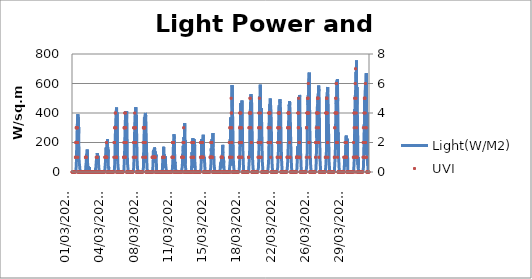
| Category | Light(W/M2) |
|---|---|
|  01/03/2022 00:20:09 | 0 |
|  01/03/2022 00:50:09 | 0 |
|  01/03/2022 01:20:09 | 0 |
|  01/03/2022 01:50:09 | 0 |
|  01/03/2022 02:20:09 | 0 |
|  01/03/2022 02:50:09 | 0 |
|  01/03/2022 03:20:09 | 0 |
|  01/03/2022 03:50:09 | 0 |
|  01/03/2022 04:20:09 | 0 |
|  01/03/2022 04:50:09 | 0 |
|  01/03/2022 05:20:09 | 0 |
|  01/03/2022 05:50:09 | 0 |
|  01/03/2022 06:20:09 | 0 |
|  01/03/2022 06:50:09 | 0 |
|  01/03/2022 07:20:09 | 6.9 |
|  01/03/2022 07:50:09 | 28.1 |
|  01/03/2022 08:20:09 | 44.2 |
|  01/03/2022 08:50:09 | 107 |
|  01/03/2022 09:20:09 | 170.4 |
|  01/03/2022 09:50:09 | 222.9 |
|  01/03/2022 10:20:09 | 274.5 |
|  01/03/2022 10:50:09 | 315.4 |
|  01/03/2022 11:20:09 | 345.7 |
|  01/03/2022 11:50:09 | 383.4 |
|  01/03/2022 12:20:09 | 391.7 |
|  01/03/2022 12:50:09 | 91.9 |
|  01/03/2022 15:54:06 | 243.7 |
|  01/03/2022 16:24:06 | 371.8 |
|  01/03/2022 16:54:06 | 261.1 |
|  01/03/2022 17:24:06 | 156.6 |
|  01/03/2022 17:54:06 | 82 |
|  01/03/2022 18:24:06 | 58.5 |
|  01/03/2022 18:54:06 | 47.7 |
|  01/03/2022 19:24:06 | 36 |
|  01/03/2022 19:54:06 | 18.1 |
|  01/03/2022 20:24:06 | 2.1 |
|  01/03/2022 20:54:06 | 0 |
|  01/03/2022 21:24:06 | 0 |
|  01/03/2022 21:54:06 | 0 |
|  01/03/2022 22:24:06 | 0 |
|  01/03/2022 22:54:06 | 0 |
|  01/03/2022 23:24:06 | 0 |
|  01/03/2022 23:54:06 | 0 |
|  02/03/2022 00:24:06 | 0 |
|  02/03/2022 00:54:06 | 0 |
|  02/03/2022 01:24:06 | 0 |
|  02/03/2022 01:54:06 | 0 |
|  02/03/2022 02:24:06 | 0 |
|  02/03/2022 02:54:06 | 0 |
|  02/03/2022 03:24:06 | 0 |
|  02/03/2022 03:54:06 | 0 |
|  02/03/2022 04:24:06 | 0 |
|  02/03/2022 04:54:06 | 0 |
|  02/03/2022 05:24:06 | 0 |
|  02/03/2022 05:54:06 | 0 |
|  02/03/2022 06:24:06 | 0 |
|  02/03/2022 06:54:06 | 0 |
|  02/03/2022 07:24:06 | 0 |
|  02/03/2022 07:54:06 | 0 |
|  02/03/2022 08:24:06 | 0 |
|  02/03/2022 08:54:06 | 0 |
|  02/03/2022 09:24:06 | 0 |
|  02/03/2022 09:54:06 | 5.1 |
|  02/03/2022 10:24:06 | 17.7 |
|  02/03/2022 10:54:06 | 50.6 |
|  02/03/2022 11:24:06 | 59 |
|  02/03/2022 11:54:06 | 60.7 |
|  02/03/2022 12:24:06 | 121.4 |
|  02/03/2022 12:54:06 | 101 |
|  02/03/2022 13:24:06 | 78.1 |
|  02/03/2022 13:54:06 | 130.5 |
|  02/03/2022 14:24:06 | 152.2 |
|  02/03/2022 14:54:06 | 82 |
|  02/03/2022 15:24:06 | 39.4 |
|  02/03/2022 15:54:06 | 24.7 |
|  02/03/2022 16:24:06 | 18.1 |
|  02/03/2022 16:54:06 | 39 |
|  02/03/2022 17:24:06 | 21.6 |
|  02/03/2022 17:54:06 | 15.2 |
|  02/03/2022 18:24:06 | 6.5 |
|  02/03/2022 18:54:06 | 3.4 |
|  02/03/2022 19:24:06 | 34.3 |
|  02/03/2022 19:54:06 | 1.2 |
|  02/03/2022 20:24:06 | 0 |
|  02/03/2022 20:54:06 | 0 |
|  02/03/2022 21:24:06 | 0 |
|  02/03/2022 21:54:06 | 0 |
|  02/03/2022 22:24:06 | 0 |
|  02/03/2022 22:54:06 | 0 |
|  02/03/2022 23:24:06 | 0 |
|  02/03/2022 23:54:06 | 0 |
|  03/03/2022 00:24:06 | 0 |
|  03/03/2022 00:54:06 | 0 |
|  03/03/2022 01:24:06 | 0 |
|  03/03/2022 01:54:06 | 0 |
|  03/03/2022 02:24:06 | 0 |
|  03/03/2022 02:54:06 | 0 |
|  03/03/2022 03:24:06 | 0 |
|  03/03/2022 03:54:06 | 0 |
|  03/03/2022 04:24:06 | 0 |
|  03/03/2022 04:54:06 | 0 |
|  03/03/2022 05:24:06 | 0 |
|  03/03/2022 05:54:06 | 0 |
|  03/03/2022 06:24:06 | 0 |
|  03/03/2022 06:54:06 | 0 |
|  03/03/2022 07:24:06 | 0 |
|  03/03/2022 07:54:06 | 0 |
|  03/03/2022 08:24:06 | 0 |
|  03/03/2022 08:54:06 | 0 |
|  03/03/2022 09:24:06 | 0 |
|  03/03/2022 09:54:06 | 3.4 |
|  03/03/2022 10:24:06 | 8.2 |
|  03/03/2022 10:54:06 | 21.6 |
|  03/03/2022 11:24:06 | 22.9 |
|  03/03/2022 11:54:06 | 32.1 |
|  03/03/2022 12:24:06 | 56.8 |
|  03/03/2022 12:54:06 | 59.8 |
|  03/03/2022 13:24:06 | 91 |
|  03/03/2022 13:54:06 | 77.6 |
|  03/03/2022 14:24:06 | 64.1 |
|  03/03/2022 14:54:06 | 96.3 |
|  03/03/2022 15:24:06 | 128.3 |
|  03/03/2022 15:54:06 | 91.9 |
|  03/03/2022 16:24:06 | 71.9 |
|  03/03/2022 16:54:06 | 109.7 |
|  03/03/2022 17:24:06 | 58.1 |
|  03/03/2022 17:54:06 | 107.5 |
|  03/03/2022 18:24:06 | 59.3 |
|  03/03/2022 18:54:06 | 37.2 |
|  03/03/2022 19:24:06 | 21.2 |
|  03/03/2022 19:54:06 | 4.8 |
|  03/03/2022 20:24:06 | 0 |
|  03/03/2022 20:54:06 | 0 |
|  03/03/2022 21:24:06 | 0 |
|  03/03/2022 21:54:06 | 0 |
|  03/03/2022 22:24:06 | 0 |
|  03/03/2022 22:54:06 | 0 |
|  03/03/2022 23:24:06 | 0 |
|  03/03/2022 23:54:06 | 0 |
|  04/03/2022 00:24:06 | 0 |
|  04/03/2022 00:54:06 | 0 |
|  04/03/2022 01:24:06 | 0 |
|  04/03/2022 01:54:06 | 0 |
|  04/03/2022 02:24:06 | 0 |
|  04/03/2022 02:54:06 | 0 |
|  04/03/2022 03:24:06 | 0 |
|  04/03/2022 03:54:06 | 0 |
|  04/03/2022 04:24:06 | 0 |
|  04/03/2022 04:54:06 | 0 |
|  04/03/2022 05:24:06 | 0 |
|  04/03/2022 05:54:06 | 0 |
|  04/03/2022 06:24:06 | 0 |
|  04/03/2022 06:54:06 | 0 |
|  04/03/2022 07:24:06 | 0 |
|  04/03/2022 07:54:06 | 0 |
|  04/03/2022 08:24:06 | 0 |
|  04/03/2022 08:54:06 | 0 |
|  04/03/2022 09:24:06 | 0 |
|  04/03/2022 09:54:06 | 11.3 |
|  04/03/2022 10:24:06 | 20.3 |
|  04/03/2022 10:54:06 | 42.4 |
|  04/03/2022 11:24:06 | 58.1 |
|  04/03/2022 11:54:06 | 88.4 |
|  04/03/2022 12:24:06 | 94.1 |
|  04/03/2022 12:54:06 | 133.1 |
|  04/03/2022 13:24:06 | 166.5 |
|  04/03/2022 13:54:06 | 117.4 |
|  04/03/2022 14:24:06 | 143.5 |
|  04/03/2022 14:54:06 | 151.8 |
|  04/03/2022 15:24:06 | 147.9 |
|  04/03/2022 15:54:06 | 197.3 |
|  04/03/2022 16:24:06 | 142.6 |
|  04/03/2022 16:54:06 | 223.7 |
|  04/03/2022 17:24:06 | 90.6 |
|  04/03/2022 17:54:06 | 151.8 |
|  04/03/2022 18:24:06 | 92.4 |
|  04/03/2022 18:54:06 | 27.6 |
|  04/03/2022 19:24:06 | 40.7 |
|  04/03/2022 19:54:06 | 22.9 |
|  04/03/2022 20:24:06 | 2.9 |
|  04/03/2022 20:54:06 | 0 |
|  04/03/2022 21:24:06 | 0 |
|  04/03/2022 21:54:06 | 0 |
|  04/03/2022 22:24:06 | 0 |
|  04/03/2022 22:54:06 | 0 |
|  04/03/2022 23:24:06 | 0 |
|  04/03/2022 23:54:06 | 0 |
|  05/03/2022 00:24:06 | 0 |
|  05/03/2022 00:54:06 | 0 |
|  05/03/2022 01:24:06 | 0 |
|  05/03/2022 01:54:06 | 0 |
|  05/03/2022 02:24:06 | 0 |
|  05/03/2022 02:54:06 | 0 |
|  05/03/2022 03:24:06 | 0 |
|  05/03/2022 03:54:06 | 0 |
|  05/03/2022 04:24:06 | 0 |
|  05/03/2022 04:54:06 | 0 |
|  05/03/2022 05:24:06 | 0 |
|  05/03/2022 05:54:06 | 0 |
|  05/03/2022 06:24:06 | 0 |
|  05/03/2022 06:54:06 | 0 |
|  05/03/2022 07:24:06 | 0 |
|  05/03/2022 07:54:06 | 0 |
|  05/03/2022 08:24:06 | 0 |
|  05/03/2022 08:54:06 | 0 |
|  05/03/2022 09:24:06 | 0.9 |
|  05/03/2022 09:54:06 | 14.3 |
|  05/03/2022 10:24:06 | 33.4 |
|  05/03/2022 10:54:06 | 60.2 |
|  05/03/2022 11:24:06 | 134 |
|  05/03/2022 11:54:06 | 202.6 |
|  05/03/2022 12:24:06 | 255.9 |
|  05/03/2022 12:54:06 | 304.9 |
|  05/03/2022 13:24:06 | 340.9 |
|  05/03/2022 13:54:06 | 380 |
|  05/03/2022 14:24:06 | 396 |
|  05/03/2022 14:54:06 | 419.9 |
|  05/03/2022 15:24:06 | 437.7 |
|  05/03/2022 15:54:06 | 77.6 |
|  05/03/2022 16:24:06 | 404.2 |
|  05/03/2022 16:54:06 | 182.5 |
|  05/03/2022 17:24:06 | 192.1 |
|  05/03/2022 17:54:06 | 132.2 |
|  05/03/2022 18:24:06 | 65.4 |
|  05/03/2022 18:54:06 | 59.8 |
|  05/03/2022 19:24:06 | 26.8 |
|  05/03/2022 19:54:06 | 21.2 |
|  05/03/2022 20:24:06 | 4.3 |
|  05/03/2022 20:54:06 | 0 |
|  05/03/2022 21:24:06 | 0 |
|  05/03/2022 21:54:06 | 0 |
|  05/03/2022 22:24:06 | 0 |
|  05/03/2022 22:54:06 | 0 |
|  05/03/2022 23:24:06 | 0 |
|  05/03/2022 23:54:06 | 0 |
|  06/03/2022 00:24:06 | 0 |
|  06/03/2022 00:54:06 | 0 |
|  06/03/2022 01:24:06 | 0 |
|  06/03/2022 01:54:06 | 0 |
|  06/03/2022 02:24:06 | 0 |
|  06/03/2022 02:54:06 | 0 |
|  06/03/2022 03:24:06 | 0 |
|  06/03/2022 03:54:06 | 0 |
|  06/03/2022 04:24:06 | 0 |
|  06/03/2022 04:54:06 | 0 |
|  06/03/2022 05:24:06 | 0 |
|  06/03/2022 05:54:06 | 0 |
|  06/03/2022 06:24:06 | 0 |
|  06/03/2022 06:54:06 | 0 |
|  06/03/2022 07:24:06 | 0 |
|  06/03/2022 07:54:06 | 0 |
|  06/03/2022 08:24:06 | 0 |
|  06/03/2022 08:54:06 | 0 |
|  06/03/2022 09:24:06 | 1.2 |
|  06/03/2022 09:54:06 | 17.7 |
|  06/03/2022 10:24:06 | 53.7 |
|  06/03/2022 10:54:06 | 55.9 |
|  06/03/2022 11:24:06 | 116.6 |
|  06/03/2022 11:54:06 | 200.7 |
|  06/03/2022 12:24:06 | 265.5 |
|  06/03/2022 12:54:06 | 316.2 |
|  06/03/2022 13:24:06 | 351.3 |
|  06/03/2022 13:54:06 | 386.5 |
|  06/03/2022 14:24:06 | 413.4 |
|  06/03/2022 14:54:06 | 366 |
|  06/03/2022 15:24:06 | 170.4 |
|  06/03/2022 15:54:06 | 155.7 |
|  06/03/2022 16:24:06 | 412.5 |
|  06/03/2022 16:54:06 | 401.3 |
|  06/03/2022 17:24:06 | 275.4 |
|  06/03/2022 17:54:06 | 206.9 |
|  06/03/2022 18:24:06 | 96.6 |
|  06/03/2022 18:54:06 | 55.1 |
|  06/03/2022 19:24:06 | 37.2 |
|  06/03/2022 19:54:06 | 25.1 |
|  06/03/2022 20:24:06 | 4.8 |
|  06/03/2022 20:54:06 | 0 |
|  06/03/2022 21:24:06 | 0 |
|  06/03/2022 21:54:06 | 0 |
|  06/03/2022 22:24:06 | 0 |
|  06/03/2022 22:54:06 | 0 |
|  06/03/2022 23:24:06 | 0 |
|  06/03/2022 23:54:06 | 0 |
|  07/03/2022 00:24:06 | 0 |
|  07/03/2022 00:54:06 | 0 |
|  07/03/2022 01:24:06 | 0 |
|  07/03/2022 01:54:06 | 0 |
|  07/03/2022 02:24:06 | 0 |
|  07/03/2022 02:54:06 | 0 |
|  07/03/2022 03:24:06 | 0 |
|  07/03/2022 03:54:06 | 0 |
|  07/03/2022 04:24:06 | 0 |
|  07/03/2022 04:54:06 | 0 |
|  07/03/2022 05:24:06 | 0 |
|  07/03/2022 05:54:06 | 0 |
|  07/03/2022 06:24:06 | 0 |
|  07/03/2022 06:54:06 | 0 |
|  07/03/2022 07:24:06 | 0 |
|  07/03/2022 07:54:06 | 0 |
|  07/03/2022 08:24:06 | 0 |
|  07/03/2022 08:54:06 | 0 |
|  07/03/2022 09:24:06 | 1.2 |
|  07/03/2022 09:54:06 | 18.1 |
|  07/03/2022 10:24:06 | 47.2 |
|  07/03/2022 10:54:06 | 85 |
|  07/03/2022 11:24:06 | 95.4 |
|  07/03/2022 11:54:06 | 199.9 |
|  07/03/2022 12:24:06 | 256.8 |
|  07/03/2022 12:54:06 | 319.7 |
|  07/03/2022 13:24:06 | 357 |
|  07/03/2022 13:54:06 | 386.9 |
|  07/03/2022 14:24:06 | 406 |
|  07/03/2022 14:54:06 | 168.2 |
|  07/03/2022 15:24:06 | 438.9 |
|  07/03/2022 15:54:06 | 312.7 |
|  07/03/2022 16:24:06 | 386.9 |
|  07/03/2022 16:54:06 | 340.5 |
|  07/03/2022 17:24:06 | 274.5 |
|  07/03/2022 17:54:06 | 212.1 |
|  07/03/2022 18:24:06 | 124 |
|  07/03/2022 18:54:06 | 57.3 |
|  07/03/2022 19:24:06 | 41.1 |
|  07/03/2022 19:54:06 | 23.9 |
|  07/03/2022 20:24:06 | 6.9 |
|  07/03/2022 20:54:06 | 0 |
|  07/03/2022 21:24:06 | 0 |
|  07/03/2022 21:54:06 | 0 |
|  07/03/2022 22:24:06 | 0 |
|  07/03/2022 22:54:06 | 0 |
|  07/03/2022 23:24:06 | 0 |
|  07/03/2022 23:54:06 | 0 |
|  08/03/2022 00:24:06 | 0 |
|  08/03/2022 00:54:06 | 0 |
|  08/03/2022 01:24:06 | 0 |
|  08/03/2022 01:54:06 | 0 |
|  08/03/2022 02:24:06 | 0 |
|  08/03/2022 02:54:06 | 0 |
|  08/03/2022 03:24:06 | 0 |
|  08/03/2022 03:54:06 | 0 |
|  08/03/2022 04:24:06 | 0 |
|  08/03/2022 04:54:06 | 0 |
|  08/03/2022 05:24:06 | 0 |
|  08/03/2022 05:54:06 | 0 |
|  08/03/2022 06:24:06 | 0 |
|  08/03/2022 06:54:06 | 0 |
|  08/03/2022 07:24:06 | 0 |
|  08/03/2022 07:54:06 | 0 |
|  08/03/2022 08:24:06 | 0 |
|  08/03/2022 08:54:06 | 0 |
|  08/03/2022 09:24:06 | 2.6 |
|  08/03/2022 09:54:06 | 21.2 |
|  08/03/2022 10:24:06 | 28.6 |
|  08/03/2022 10:54:06 | 87.1 |
|  08/03/2022 11:24:06 | 130 |
|  08/03/2022 11:54:06 | 64.6 |
|  08/03/2022 12:24:06 | 258 |
|  08/03/2022 12:54:06 | 371.3 |
|  08/03/2022 13:24:06 | 348.8 |
|  08/03/2022 13:54:06 | 372.6 |
|  08/03/2022 14:24:06 | 380.3 |
|  08/03/2022 14:54:06 | 382.2 |
|  08/03/2022 15:24:06 | 400.4 |
|  08/03/2022 15:54:06 | 403 |
|  08/03/2022 16:24:06 | 375.2 |
|  08/03/2022 16:54:06 | 294.5 |
|  08/03/2022 17:24:06 | 247.2 |
|  08/03/2022 17:54:06 | 203.4 |
|  08/03/2022 18:24:06 | 141.4 |
|  08/03/2022 18:54:06 | 75.8 |
|  08/03/2022 19:24:06 | 33.4 |
|  08/03/2022 19:54:06 | 13.8 |
|  08/03/2022 20:24:06 | 5.1 |
|  08/03/2022 20:54:06 | 0 |
|  08/03/2022 21:24:06 | 0 |
|  08/03/2022 21:54:06 | 0 |
|  08/03/2022 22:24:06 | 0 |
|  08/03/2022 22:54:06 | 0 |
|  08/03/2022 23:24:06 | 0 |
|  08/03/2022 23:54:06 | 0 |
|  09/03/2022 00:24:06 | 0 |
|  09/03/2022 00:54:06 | 0 |
|  09/03/2022 01:24:06 | 0 |
|  09/03/2022 01:54:06 | 0 |
|  09/03/2022 02:24:06 | 0 |
|  09/03/2022 02:54:06 | 0 |
|  09/03/2022 03:24:06 | 0 |
|  09/03/2022 03:54:06 | 0 |
|  09/03/2022 04:24:06 | 0 |
|  09/03/2022 04:54:06 | 0 |
|  09/03/2022 05:24:06 | 0 |
|  09/03/2022 05:54:06 | 0 |
|  09/03/2022 06:24:06 | 0 |
|  09/03/2022 06:54:06 | 0 |
|  09/03/2022 07:24:06 | 0 |
|  09/03/2022 07:54:06 | 0 |
|  09/03/2022 08:24:06 | 0 |
|  09/03/2022 08:54:06 | 0 |
|  09/03/2022 09:24:06 | 2.9 |
|  09/03/2022 09:54:06 | 26.8 |
|  09/03/2022 10:24:06 | 47.2 |
|  09/03/2022 10:54:06 | 102.8 |
|  09/03/2022 11:24:06 | 149.6 |
|  09/03/2022 11:54:06 | 63.2 |
|  09/03/2022 12:24:06 | 111 |
|  09/03/2022 12:54:06 | 77.2 |
|  09/03/2022 13:24:06 | 70.7 |
|  09/03/2022 13:54:06 | 165.6 |
|  09/03/2022 14:24:06 | 167 |
|  09/03/2022 14:54:06 | 158.3 |
|  09/03/2022 15:24:06 | 111 |
|  09/03/2022 15:54:06 | 138.4 |
|  09/03/2022 16:24:06 | 117.1 |
|  09/03/2022 16:54:06 | 112.3 |
|  09/03/2022 17:24:06 | 99.7 |
|  09/03/2022 17:54:06 | 117.9 |
|  09/03/2022 18:24:06 | 109.2 |
|  09/03/2022 18:54:06 | 46.7 |
|  09/03/2022 19:24:06 | 13.3 |
|  09/03/2022 19:54:06 | 5.1 |
|  09/03/2022 20:24:06 | 1.2 |
|  09/03/2022 20:54:06 | 0 |
|  09/03/2022 21:24:06 | 0 |
|  09/03/2022 21:54:06 | 0 |
|  09/03/2022 22:24:06 | 0 |
|  09/03/2022 22:54:06 | 0 |
|  09/03/2022 23:24:06 | 0 |
|  09/03/2022 23:54:06 | 0 |
|  10/03/2022 00:24:06 | 0 |
|  10/03/2022 00:54:06 | 0 |
|  10/03/2022 01:24:06 | 0 |
|  10/03/2022 01:54:06 | 0 |
|  10/03/2022 02:24:06 | 0 |
|  10/03/2022 02:54:06 | 0 |
|  10/03/2022 03:24:06 | 0 |
|  10/03/2022 03:54:06 | 0 |
|  10/03/2022 04:24:06 | 0 |
|  10/03/2022 04:54:06 | 0 |
|  10/03/2022 05:24:06 | 0 |
|  10/03/2022 05:54:06 | 0 |
|  10/03/2022 06:24:06 | 0 |
|  10/03/2022 06:54:06 | 0 |
|  10/03/2022 07:24:06 | 0 |
|  10/03/2022 07:54:06 | 0 |
|  10/03/2022 08:24:06 | 0 |
|  10/03/2022 08:54:06 | 0 |
|  10/03/2022 09:24:06 | 1.2 |
|  10/03/2022 09:54:06 | 18.1 |
|  10/03/2022 10:24:06 | 58.1 |
|  10/03/2022 10:54:06 | 40.2 |
|  10/03/2022 11:24:06 | 96.6 |
|  10/03/2022 11:54:06 | 92.4 |
|  10/03/2022 12:24:06 | 83.7 |
|  10/03/2022 12:54:06 | 170.4 |
|  10/03/2022 13:24:06 | 106.2 |
|  10/03/2022 13:54:06 | 121.8 |
|  10/03/2022 14:24:06 | 63.7 |
|  10/03/2022 14:54:06 | 97.1 |
|  10/03/2022 15:24:06 | 53.3 |
|  10/03/2022 15:54:06 | 63.2 |
|  10/03/2022 16:24:06 | 29 |
|  10/03/2022 16:54:06 | 106.2 |
|  10/03/2022 17:24:06 | 68 |
|  10/03/2022 17:54:06 | 62 |
|  10/03/2022 18:24:06 | 41.6 |
|  10/03/2022 18:54:06 | 26.8 |
|  10/03/2022 19:24:06 | 16.9 |
|  10/03/2022 19:54:06 | 7.7 |
|  10/03/2022 20:24:06 | 7.7 |
|  10/03/2022 20:54:06 | 0 |
|  10/03/2022 21:24:06 | 0 |
|  10/03/2022 21:54:06 | 0 |
|  10/03/2022 22:24:06 | 0 |
|  10/03/2022 22:54:06 | 0 |
|  10/03/2022 23:24:06 | 0 |
|  10/03/2022 23:54:06 | 0 |
|  11/03/2022 00:24:06 | 0 |
|  11/03/2022 00:54:06 | 0 |
|  11/03/2022 01:24:06 | 0 |
|  11/03/2022 01:54:06 | 0 |
|  11/03/2022 02:24:06 | 0 |
|  11/03/2022 02:54:06 | 0 |
|  11/03/2022 03:24:06 | 0 |
|  11/03/2022 03:54:06 | 0 |
|  11/03/2022 04:24:06 | 0 |
|  11/03/2022 04:54:06 | 0 |
|  11/03/2022 05:24:06 | 0 |
|  11/03/2022 05:54:06 | 0 |
|  11/03/2022 06:24:06 | 0 |
|  11/03/2022 06:54:06 | 0 |
|  11/03/2022 07:24:06 | 0 |
|  11/03/2022 07:54:06 | 0 |
|  11/03/2022 08:24:06 | 0 |
|  11/03/2022 08:54:06 | 0 |
|  11/03/2022 09:24:06 | 0 |
|  11/03/2022 09:54:06 | 3.8 |
|  11/03/2022 10:24:06 | 14.3 |
|  11/03/2022 10:54:06 | 22.9 |
|  11/03/2022 11:24:06 | 19.4 |
|  11/03/2022 11:54:06 | 22.9 |
|  11/03/2022 12:24:06 | 104.5 |
|  11/03/2022 12:54:06 | 117.1 |
|  11/03/2022 13:24:06 | 188.6 |
|  11/03/2022 13:54:06 | 207.4 |
|  11/03/2022 14:24:06 | 217.8 |
|  11/03/2022 14:54:06 | 255.9 |
|  11/03/2022 15:24:06 | 225.5 |
|  11/03/2022 15:54:06 | 207.4 |
|  11/03/2022 16:24:06 | 115.7 |
|  11/03/2022 16:54:06 | 58.5 |
|  11/03/2022 17:24:06 | 68.9 |
|  11/03/2022 17:54:06 | 27.3 |
|  11/03/2022 18:24:06 | 25.6 |
|  11/03/2022 18:54:06 | 21.6 |
|  11/03/2022 19:24:06 | 14.7 |
|  11/03/2022 19:54:06 | 7.3 |
|  11/03/2022 20:24:06 | 0.4 |
|  11/03/2022 20:54:06 | 0 |
|  11/03/2022 21:24:06 | 0 |
|  11/03/2022 21:54:06 | 0 |
|  11/03/2022 22:24:06 | 0 |
|  11/03/2022 22:54:06 | 0 |
|  11/03/2022 23:24:06 | 0 |
|  11/03/2022 23:54:06 | 0 |
|  12/03/2022 00:24:06 | 0 |
|  12/03/2022 00:54:06 | 0 |
|  12/03/2022 01:24:06 | 0 |
|  12/03/2022 01:54:06 | 0 |
|  12/03/2022 02:24:06 | 0 |
|  12/03/2022 02:54:06 | 0 |
|  12/03/2022 03:24:06 | 0 |
|  12/03/2022 03:54:06 | 0 |
|  12/03/2022 04:24:06 | 0 |
|  12/03/2022 04:54:06 | 0 |
|  12/03/2022 05:24:06 | 0 |
|  12/03/2022 05:54:06 | 0 |
|  12/03/2022 06:24:06 | 0 |
|  12/03/2022 06:54:06 | 0 |
|  12/03/2022 07:24:06 | 0 |
|  12/03/2022 07:54:06 | 0 |
|  12/03/2022 08:24:06 | 0 |
|  12/03/2022 08:54:06 | 0 |
|  12/03/2022 09:24:06 | 2.1 |
|  12/03/2022 09:54:06 | 8.6 |
|  12/03/2022 10:24:06 | 22 |
|  12/03/2022 10:54:06 | 20.8 |
|  12/03/2022 11:24:06 | 32.9 |
|  12/03/2022 11:54:06 | 65.4 |
|  12/03/2022 12:24:06 | 121 |
|  12/03/2022 12:54:06 | 86.2 |
|  12/03/2022 13:24:06 | 126.1 |
|  12/03/2022 13:54:06 | 178.2 |
|  12/03/2022 14:24:06 | 121 |
|  12/03/2022 14:54:06 | 175.7 |
|  12/03/2022 15:24:06 | 40.2 |
|  12/03/2022 15:54:06 | 236.4 |
|  12/03/2022 16:24:06 | 204.7 |
|  12/03/2022 16:54:06 | 113.2 |
|  12/03/2022 17:24:06 | 332.3 |
|  12/03/2022 17:54:06 | 52 |
|  12/03/2022 18:24:06 | 217.3 |
|  12/03/2022 18:54:06 | 60.7 |
|  12/03/2022 19:24:06 | 36.8 |
|  12/03/2022 19:54:06 | 25.9 |
|  12/03/2022 20:24:06 | 8.6 |
|  12/03/2022 20:54:06 | 0 |
|  12/03/2022 21:24:06 | 0 |
|  12/03/2022 21:54:06 | 0 |
|  12/03/2022 22:24:06 | 0 |
|  12/03/2022 22:54:06 | 0 |
|  12/03/2022 23:24:06 | 0 |
|  12/03/2022 23:54:06 | 0 |
|  13/03/2022 00:24:06 | 0 |
|  13/03/2022 00:54:06 | 0 |
|  13/03/2022 01:24:06 | 0 |
|  13/03/2022 01:54:06 | 0 |
|  13/03/2022 02:24:06 | 0 |
|  13/03/2022 02:54:06 | 0 |
|  13/03/2022 03:24:06 | 0 |
|  13/03/2022 03:54:06 | 0 |
|  13/03/2022 04:24:06 | 0 |
|  13/03/2022 04:54:06 | 0 |
|  13/03/2022 05:24:06 | 0 |
|  13/03/2022 05:54:06 | 0 |
|  13/03/2022 06:24:06 | 0 |
|  13/03/2022 06:54:06 | 0 |
|  13/03/2022 07:24:06 | 0 |
|  13/03/2022 07:54:06 | 0 |
|  13/03/2022 08:24:06 | 0 |
|  13/03/2022 08:54:06 | 0 |
|  13/03/2022 09:24:06 | 0 |
|  13/03/2022 09:54:06 | 6.5 |
|  13/03/2022 10:24:06 | 7.3 |
|  13/03/2022 10:54:06 | 10.8 |
|  13/03/2022 11:24:06 | 89.3 |
|  13/03/2022 11:54:06 | 134 |
|  13/03/2022 12:24:06 | 88.8 |
|  13/03/2022 12:54:06 | 52.5 |
|  13/03/2022 13:24:06 | 38.2 |
|  13/03/2022 13:54:06 | 228.2 |
|  13/03/2022 14:24:06 | 208.2 |
|  13/03/2022 14:54:06 | 150 |
|  13/03/2022 15:24:06 | 83.2 |
|  13/03/2022 15:54:06 | 28.6 |
|  13/03/2022 16:24:06 | 36.3 |
|  13/03/2022 16:54:06 | 223.4 |
|  13/03/2022 17:24:06 | 146.2 |
|  13/03/2022 17:54:06 | 205.2 |
|  13/03/2022 18:24:06 | 179.6 |
|  13/03/2022 18:54:06 | 68.5 |
|  13/03/2022 19:24:06 | 47.7 |
|  13/03/2022 19:54:06 | 31.6 |
|  13/03/2022 20:24:06 | 2.1 |
|  13/03/2022 20:54:06 | 0 |
|  13/03/2022 21:24:06 | 0 |
|  13/03/2022 21:54:06 | 0 |
|  13/03/2022 22:24:06 | 0 |
|  13/03/2022 22:54:06 | 0 |
|  13/03/2022 23:24:06 | 0 |
|  13/03/2022 23:54:06 | 0 |
|  14/03/2022 00:24:06 | 0 |
|  14/03/2022 00:54:06 | 0 |
|  14/03/2022 01:24:06 | 0 |
|  14/03/2022 01:54:06 | 0 |
|  14/03/2022 02:24:06 | 0 |
|  14/03/2022 02:54:06 | 0 |
|  14/03/2022 03:24:06 | 0 |
|  14/03/2022 03:54:06 | 0 |
|  14/03/2022 04:24:06 | 0 |
|  14/03/2022 04:54:06 | 0 |
|  14/03/2022 05:24:06 | 0 |
|  14/03/2022 05:54:06 | 0 |
|  14/03/2022 06:24:06 | 0 |
|  14/03/2022 06:54:06 | 0 |
|  14/03/2022 07:24:06 | 0 |
|  14/03/2022 07:54:06 | 0 |
|  14/03/2022 08:24:06 | 0 |
|  14/03/2022 08:54:06 | 0 |
|  14/03/2022 09:24:06 | 5.1 |
|  14/03/2022 09:54:06 | 20.3 |
|  14/03/2022 10:24:06 | 49.8 |
|  14/03/2022 10:54:06 | 71.9 |
|  14/03/2022 11:24:06 | 142.3 |
|  14/03/2022 11:54:06 | 224.2 |
|  14/03/2022 12:24:06 | 212.1 |
|  14/03/2022 12:54:06 | 124.9 |
|  14/03/2022 13:24:06 | 190.8 |
|  14/03/2022 13:54:06 | 124 |
|  14/03/2022 14:24:06 | 165.3 |
|  14/03/2022 14:54:06 | 204.7 |
|  14/03/2022 15:24:06 | 227.3 |
|  14/03/2022 15:54:06 | 252.4 |
|  14/03/2022 16:24:06 | 164.3 |
|  14/03/2022 16:54:06 | 103.1 |
|  14/03/2022 17:24:06 | 99.7 |
|  14/03/2022 17:54:06 | 75 |
|  14/03/2022 18:24:06 | 101.9 |
|  14/03/2022 18:54:06 | 91.5 |
|  14/03/2022 19:24:06 | 54.6 |
|  14/03/2022 19:54:06 | 32.9 |
|  14/03/2022 20:24:06 | 6.9 |
|  14/03/2022 20:54:06 | 0.9 |
|  14/03/2022 21:24:06 | 0 |
|  14/03/2022 21:54:06 | 0 |
|  14/03/2022 22:24:06 | 0 |
|  14/03/2022 22:54:06 | 0 |
|  14/03/2022 23:24:06 | 0 |
|  14/03/2022 23:54:06 | 0 |
|  15/03/2022 00:24:06 | 0 |
|  15/03/2022 00:54:06 | 0 |
|  15/03/2022 01:24:06 | 0 |
|  15/03/2022 01:54:06 | 0 |
|  15/03/2022 02:24:06 | 0 |
|  15/03/2022 02:54:06 | 0 |
|  15/03/2022 03:24:06 | 0 |
|  15/03/2022 03:54:06 | 0 |
|  15/03/2022 04:24:06 | 0 |
|  15/03/2022 04:54:06 | 0 |
|  15/03/2022 05:24:06 | 0 |
|  15/03/2022 05:54:06 | 0 |
|  15/03/2022 06:24:06 | 0 |
|  15/03/2022 06:54:06 | 0 |
|  15/03/2022 07:24:06 | 0 |
|  15/03/2022 07:54:06 | 0 |
|  15/03/2022 08:24:06 | 0 |
|  15/03/2022 08:54:06 | 0 |
|  15/03/2022 09:24:06 | 9.5 |
|  15/03/2022 09:54:06 | 15.2 |
|  15/03/2022 10:24:06 | 27.3 |
|  15/03/2022 10:54:06 | 51.1 |
|  15/03/2022 11:24:06 | 112.7 |
|  15/03/2022 11:54:06 | 160 |
|  15/03/2022 12:24:06 | 118.8 |
|  15/03/2022 12:54:06 | 148.8 |
|  15/03/2022 13:24:06 | 203.8 |
|  15/03/2022 13:54:06 | 222.9 |
|  15/03/2022 14:24:06 | 134.4 |
|  15/03/2022 14:54:06 | 111 |
|  15/03/2022 15:24:06 | 164.8 |
|  15/03/2022 15:54:06 | 263.8 |
|  15/03/2022 16:24:06 | 170 |
|  15/03/2022 16:54:06 | 95.8 |
|  15/03/2022 17:24:06 | 92.4 |
|  15/03/2022 17:54:06 | 106.7 |
|  15/03/2022 18:24:06 | 81.1 |
|  15/03/2022 18:54:06 | 50.3 |
|  15/03/2022 19:24:06 | 46.4 |
|  15/03/2022 19:54:06 | 26.8 |
|  15/03/2022 20:24:06 | 9.5 |
|  15/03/2022 20:54:06 | 0.4 |
|  15/03/2022 21:24:06 | 0 |
|  15/03/2022 21:54:06 | 0 |
|  15/03/2022 22:24:06 | 0 |
|  15/03/2022 22:54:06 | 0 |
|  15/03/2022 23:24:06 | 0 |
|  15/03/2022 23:54:06 | 0 |
|  16/03/2022 00:24:06 | 0 |
|  16/03/2022 00:54:06 | 0 |
|  16/03/2022 01:24:06 | 0 |
|  16/03/2022 01:54:06 | 0 |
|  16/03/2022 02:24:06 | 0 |
|  16/03/2022 02:54:06 | 0 |
|  16/03/2022 03:24:06 | 0 |
|  16/03/2022 03:54:06 | 0 |
|  16/03/2022 04:24:06 | 0 |
|  16/03/2022 04:54:06 | 0 |
|  16/03/2022 05:24:06 | 0 |
|  16/03/2022 05:54:06 | 0 |
|  16/03/2022 06:24:06 | 0 |
|  16/03/2022 06:54:06 | 0 |
|  16/03/2022 07:24:06 | 0 |
|  16/03/2022 07:54:06 | 0 |
|  16/03/2022 08:24:06 | 0 |
|  16/03/2022 08:54:06 | 0 |
|  16/03/2022 09:24:06 | 0.4 |
|  16/03/2022 09:54:06 | 15.5 |
|  16/03/2022 10:24:06 | 28.1 |
|  16/03/2022 10:54:06 | 64.6 |
|  16/03/2022 11:24:06 | 69.7 |
|  16/03/2022 11:54:06 | 52.8 |
|  16/03/2022 12:24:06 | 25.1 |
|  16/03/2022 12:54:06 | 69.4 |
|  16/03/2022 13:24:06 | 67.6 |
|  16/03/2022 13:54:06 | 98.4 |
|  16/03/2022 14:24:06 | 90.2 |
|  16/03/2022 14:54:06 | 107.5 |
|  16/03/2022 15:24:06 | 114.9 |
|  16/03/2022 15:54:06 | 128 |
|  16/03/2022 16:24:06 | 183.9 |
|  16/03/2022 16:54:06 | 130.9 |
|  16/03/2022 17:24:06 | 85.4 |
|  16/03/2022 17:54:06 | 79.3 |
|  16/03/2022 18:24:06 | 103.1 |
|  16/03/2022 18:54:06 | 62.4 |
|  16/03/2022 19:24:06 | 37.2 |
|  16/03/2022 19:54:06 | 19.1 |
|  16/03/2022 20:24:06 | 17.2 |
|  16/03/2022 20:54:06 | 1.7 |
|  16/03/2022 21:24:06 | 0 |
|  16/03/2022 21:54:06 | 0 |
|  16/03/2022 22:24:06 | 0 |
|  16/03/2022 22:54:06 | 0 |
|  16/03/2022 23:24:06 | 0 |
|  16/03/2022 23:54:06 | 0 |
|  17/03/2022 00:24:06 | 0 |
|  17/03/2022 00:54:06 | 0 |
|  17/03/2022 01:24:06 | 0 |
|  17/03/2022 01:54:06 | 0 |
|  17/03/2022 02:24:06 | 0 |
|  17/03/2022 02:54:06 | 0 |
|  17/03/2022 03:24:06 | 0 |
|  17/03/2022 03:54:06 | 0 |
|  17/03/2022 04:24:06 | 0 |
|  17/03/2022 04:54:06 | 0 |
|  17/03/2022 05:24:06 | 0 |
|  17/03/2022 05:54:06 | 0 |
|  17/03/2022 06:24:06 | 0 |
|  17/03/2022 06:54:06 | 0 |
|  17/03/2022 07:24:06 | 0 |
|  17/03/2022 07:54:06 | 0 |
|  17/03/2022 08:24:06 | 0 |
|  17/03/2022 08:54:06 | 0.9 |
|  17/03/2022 09:24:06 | 14.3 |
|  17/03/2022 09:54:06 | 42.9 |
|  17/03/2022 10:24:06 | 36.8 |
|  17/03/2022 10:54:06 | 54.6 |
|  17/03/2022 11:24:06 | 222.9 |
|  17/03/2022 11:54:06 | 156.6 |
|  17/03/2022 12:24:06 | 368.7 |
|  17/03/2022 12:54:06 | 114 |
|  17/03/2022 13:24:06 | 88.4 |
|  17/03/2022 13:54:06 | 44.6 |
|  17/03/2022 14:24:06 | 142.3 |
|  17/03/2022 14:54:06 | 346.9 |
|  17/03/2022 15:24:06 | 94.9 |
|  17/03/2022 15:54:06 | 589 |
|  17/03/2022 16:24:06 | 443.7 |
|  17/03/2022 16:54:06 | 438.1 |
|  17/03/2022 17:24:06 | 357.3 |
|  17/03/2022 17:54:06 | 262.4 |
|  17/03/2022 18:24:06 | 190 |
|  17/03/2022 18:54:06 | 84 |
|  17/03/2022 19:24:06 | 55.4 |
|  17/03/2022 19:54:06 | 52.8 |
|  17/03/2022 20:24:06 | 20.3 |
|  17/03/2022 20:54:06 | 3.4 |
|  17/03/2022 21:24:06 | 0 |
|  17/03/2022 21:54:06 | 0 |
|  17/03/2022 22:24:06 | 0 |
|  17/03/2022 22:54:06 | 0 |
|  17/03/2022 23:24:06 | 0 |
|  17/03/2022 23:54:06 | 0 |
|  18/03/2022 00:24:06 | 0 |
|  18/03/2022 00:54:06 | 0 |
|  18/03/2022 01:24:06 | 0 |
|  18/03/2022 01:54:06 | 0 |
|  18/03/2022 02:24:06 | 0 |
|  18/03/2022 02:54:06 | 0 |
|  18/03/2022 03:24:06 | 0 |
|  18/03/2022 03:54:06 | 0 |
|  18/03/2022 04:24:06 | 0 |
|  18/03/2022 04:54:06 | 0 |
|  18/03/2022 05:24:06 | 0 |
|  18/03/2022 05:54:06 | 0 |
|  18/03/2022 06:24:06 | 0 |
|  18/03/2022 06:54:06 | 0 |
|  18/03/2022 07:24:06 | 0 |
|  18/03/2022 07:54:06 | 0 |
|  18/03/2022 08:24:06 | 0 |
|  18/03/2022 08:54:06 | 1.2 |
|  18/03/2022 09:24:06 | 10.8 |
|  18/03/2022 09:54:06 | 22.9 |
|  18/03/2022 10:24:06 | 51.1 |
|  18/03/2022 10:54:06 | 99.7 |
|  18/03/2022 11:24:06 | 194.8 |
|  18/03/2022 11:54:06 | 187.3 |
|  18/03/2022 12:24:06 | 295.3 |
|  18/03/2022 12:54:06 | 386.5 |
|  18/03/2022 13:24:06 | 450.7 |
|  18/03/2022 13:54:06 | 467.6 |
|  18/03/2022 14:24:06 | 374.7 |
|  18/03/2022 14:54:06 | 468.1 |
|  18/03/2022 15:24:06 | 173 |
|  18/03/2022 15:54:06 | 287.6 |
|  18/03/2022 16:24:06 | 484.1 |
|  18/03/2022 16:54:06 | 376.6 |
|  18/03/2022 17:24:06 | 320.1 |
|  18/03/2022 17:54:06 | 250.3 |
|  18/03/2022 18:24:06 | 153 |
|  18/03/2022 18:54:06 | 138.4 |
|  18/03/2022 19:24:06 | 97.1 |
|  18/03/2022 19:54:06 | 55.1 |
|  18/03/2022 20:24:06 | 22.9 |
|  18/03/2022 20:54:06 | 3.4 |
|  18/03/2022 21:24:06 | 0 |
|  18/03/2022 21:54:06 | 0 |
|  18/03/2022 22:24:06 | 0 |
|  18/03/2022 22:54:06 | 0 |
|  18/03/2022 23:24:06 | 0 |
|  18/03/2022 23:54:06 | 0 |
|  19/03/2022 00:24:06 | 0 |
|  19/03/2022 00:54:06 | 0 |
|  19/03/2022 01:24:06 | 0 |
|  19/03/2022 01:54:06 | 0 |
|  19/03/2022 02:24:06 | 0 |
|  19/03/2022 02:54:06 | 0 |
|  19/03/2022 03:24:06 | 0 |
|  19/03/2022 03:54:06 | 0 |
|  19/03/2022 04:24:06 | 0 |
|  19/03/2022 04:54:06 | 0 |
|  19/03/2022 05:24:06 | 0 |
|  19/03/2022 05:54:06 | 0 |
|  19/03/2022 06:24:06 | 0 |
|  19/03/2022 06:54:06 | 0 |
|  19/03/2022 07:24:06 | 0 |
|  19/03/2022 07:54:06 | 0 |
|  19/03/2022 08:24:06 | 0 |
|  19/03/2022 08:54:06 | 1.7 |
|  19/03/2022 09:24:06 | 15.2 |
|  19/03/2022 09:54:06 | 48.6 |
|  19/03/2022 10:24:06 | 66.3 |
|  19/03/2022 10:54:06 | 89.8 |
|  19/03/2022 11:24:06 | 116.2 |
|  19/03/2022 11:54:06 | 174.8 |
|  19/03/2022 12:24:06 | 328.4 |
|  19/03/2022 12:54:06 | 400.8 |
|  19/03/2022 13:24:06 | 415.9 |
|  19/03/2022 13:54:06 | 451.5 |
|  19/03/2022 14:24:06 | 501.5 |
|  19/03/2022 14:54:06 | 527.9 |
|  19/03/2022 15:24:06 | 526.2 |
|  19/03/2022 15:54:06 | 503.2 |
|  19/03/2022 16:24:06 | 490.2 |
|  19/03/2022 16:54:06 | 446.8 |
|  19/03/2022 17:24:06 | 373 |
|  19/03/2022 17:54:06 | 269.7 |
|  19/03/2022 18:24:06 | 218.1 |
|  19/03/2022 18:54:06 | 98.4 |
|  19/03/2022 19:24:06 | 57.6 |
|  19/03/2022 19:54:06 | 40.2 |
|  19/03/2022 20:24:06 | 21.6 |
|  19/03/2022 20:54:06 | 5.6 |
|  19/03/2022 21:24:06 | 0 |
|  19/03/2022 21:54:06 | 0 |
|  19/03/2022 22:24:06 | 0 |
|  19/03/2022 22:54:06 | 0 |
|  19/03/2022 23:24:06 | 0 |
|  19/03/2022 23:54:06 | 0 |
|  20/03/2022 00:24:06 | 0 |
|  20/03/2022 00:54:06 | 0 |
|  20/03/2022 01:24:06 | 0 |
|  20/03/2022 01:54:06 | 0 |
|  20/03/2022 02:24:06 | 0 |
|  20/03/2022 02:54:06 | 0 |
|  20/03/2022 03:24:06 | 0 |
|  20/03/2022 03:54:06 | 0 |
|  20/03/2022 04:24:06 | 0 |
|  20/03/2022 04:54:06 | 0 |
|  20/03/2022 05:24:06 | 0 |
|  20/03/2022 05:54:06 | 0 |
|  20/03/2022 06:24:06 | 0 |
|  20/03/2022 06:54:06 | 0 |
|  20/03/2022 07:24:06 | 0 |
|  20/03/2022 07:54:06 | 0 |
|  20/03/2022 08:24:06 | 0 |
|  20/03/2022 08:54:06 | 3.4 |
|  20/03/2022 09:24:06 | 21.6 |
|  20/03/2022 09:54:06 | 42.9 |
|  20/03/2022 10:24:06 | 95.4 |
|  20/03/2022 10:54:06 | 170 |
|  20/03/2022 11:24:06 | 232.1 |
|  20/03/2022 11:54:06 | 298 |
|  20/03/2022 12:24:06 | 369.9 |
|  20/03/2022 12:54:06 | 512.2 |
|  20/03/2022 13:24:06 | 193.9 |
|  20/03/2022 13:54:06 | 180.4 |
|  20/03/2022 14:24:06 | 591.2 |
|  20/03/2022 14:54:06 | 392.6 |
|  20/03/2022 15:24:06 | 212.1 |
|  20/03/2022 15:54:06 | 285.4 |
|  20/03/2022 16:24:06 | 200.4 |
|  20/03/2022 16:54:06 | 433.8 |
|  20/03/2022 17:24:06 | 378.3 |
|  20/03/2022 17:54:06 | 275.4 |
|  20/03/2022 18:24:06 | 214.7 |
|  20/03/2022 18:54:06 | 130.9 |
|  20/03/2022 19:24:06 | 68 |
|  20/03/2022 19:54:06 | 46.7 |
|  20/03/2022 20:24:06 | 25.6 |
|  20/03/2022 20:54:06 | 5.1 |
|  20/03/2022 21:24:06 | 0 |
|  20/03/2022 21:54:06 | 0 |
|  20/03/2022 22:24:06 | 0 |
|  20/03/2022 22:54:06 | 0 |
|  20/03/2022 23:24:06 | 0 |
|  20/03/2022 23:54:06 | 0 |
|  21/03/2022 00:24:06 | 0 |
|  21/03/2022 00:54:06 | 0 |
|  21/03/2022 01:24:06 | 0 |
|  21/03/2022 01:54:06 | 0 |
|  21/03/2022 02:24:06 | 0 |
|  21/03/2022 02:54:06 | 0 |
|  21/03/2022 03:24:06 | 0 |
|  21/03/2022 03:54:06 | 0 |
|  21/03/2022 04:24:06 | 0 |
|  21/03/2022 04:54:06 | 0 |
|  21/03/2022 05:24:06 | 0 |
|  21/03/2022 05:54:06 | 0 |
|  21/03/2022 06:24:06 | 0 |
|  21/03/2022 06:54:06 | 0 |
|  21/03/2022 07:24:06 | 0 |
|  21/03/2022 07:54:06 | 0 |
|  21/03/2022 08:24:06 | 0 |
|  21/03/2022 08:54:06 | 1.7 |
|  21/03/2022 09:24:06 | 14.3 |
|  21/03/2022 09:54:06 | 32.4 |
|  21/03/2022 10:24:06 | 48.9 |
|  21/03/2022 10:54:06 | 73.6 |
|  21/03/2022 11:24:06 | 94.6 |
|  21/03/2022 11:54:06 | 232.4 |
|  21/03/2022 12:24:06 | 355.6 |
|  21/03/2022 12:54:06 | 383.9 |
|  21/03/2022 13:24:06 | 420.3 |
|  21/03/2022 13:54:06 | 444.6 |
|  21/03/2022 14:24:06 | 461.6 |
|  21/03/2022 14:54:06 | 421.2 |
|  21/03/2022 15:24:06 | 497.5 |
|  21/03/2022 15:54:06 | 458.5 |
|  21/03/2022 16:24:06 | 461.6 |
|  21/03/2022 16:54:06 | 412.5 |
|  21/03/2022 17:24:06 | 362.6 |
|  21/03/2022 17:54:06 | 280.1 |
|  21/03/2022 18:24:06 | 203.8 |
|  21/03/2022 18:54:06 | 148.8 |
|  21/03/2022 19:24:06 | 70.7 |
|  21/03/2022 19:54:06 | 49.8 |
|  21/03/2022 20:24:06 | 26.8 |
|  21/03/2022 20:54:06 | 6 |
|  21/03/2022 21:24:06 | 0 |
|  21/03/2022 21:54:06 | 0 |
|  21/03/2022 22:24:06 | 0 |
|  21/03/2022 22:54:06 | 0 |
|  21/03/2022 23:24:06 | 0 |
|  21/03/2022 23:54:06 | 0 |
|  22/03/2022 00:24:06 | 0 |
|  22/03/2022 00:54:06 | 0 |
|  22/03/2022 01:24:06 | 0 |
|  22/03/2022 01:54:06 | 0 |
|  22/03/2022 02:24:06 | 0 |
|  22/03/2022 02:54:06 | 0 |
|  22/03/2022 03:24:06 | 0 |
|  22/03/2022 03:54:06 | 0 |
|  22/03/2022 04:24:06 | 0 |
|  22/03/2022 04:54:06 | 0 |
|  22/03/2022 05:25:06 | 0 |
|  22/03/2022 05:55:06 | 0 |
|  22/03/2022 06:25:06 | 0 |
|  22/03/2022 06:55:06 | 0 |
|  22/03/2022 07:25:06 | 0 |
|  22/03/2022 07:55:06 | 0 |
|  22/03/2022 08:25:06 | 0 |
|  22/03/2022 08:55:06 | 3.8 |
|  22/03/2022 09:25:06 | 21.2 |
|  22/03/2022 09:55:06 | 47.7 |
|  22/03/2022 10:25:06 | 71.1 |
|  22/03/2022 10:55:06 | 99.7 |
|  22/03/2022 11:25:06 | 135.3 |
|  22/03/2022 11:55:06 | 258 |
|  22/03/2022 12:25:06 | 306.7 |
|  22/03/2022 12:55:06 | 392.1 |
|  22/03/2022 13:25:06 | 452.9 |
|  22/03/2022 13:55:06 | 315.7 |
|  22/03/2022 14:25:06 | 387.8 |
|  22/03/2022 14:55:06 | 474.9 |
|  22/03/2022 15:25:06 | 493.1 |
|  22/03/2022 15:55:06 | 466.7 |
|  22/03/2022 16:25:06 | 463.7 |
|  22/03/2022 16:55:06 | 411.7 |
|  22/03/2022 17:25:06 | 350.5 |
|  22/03/2022 17:55:06 | 258 |
|  22/03/2022 18:25:06 | 179.6 |
|  22/03/2022 18:55:06 | 135.3 |
|  22/03/2022 19:25:06 | 79.8 |
|  22/03/2022 19:55:06 | 54.6 |
|  22/03/2022 20:25:06 | 25.9 |
|  22/03/2022 20:55:06 | 4.8 |
|  22/03/2022 21:25:06 | 0 |
|  22/03/2022 21:55:06 | 0 |
|  22/03/2022 22:25:06 | 0 |
|  22/03/2022 22:55:06 | 0 |
|  22/03/2022 23:25:06 | 0 |
|  22/03/2022 23:55:06 | 0 |
|  23/03/2022 00:25:06 | 0 |
|  23/03/2022 00:55:06 | 0 |
|  23/03/2022 01:25:06 | 0 |
|  23/03/2022 01:55:06 | 0 |
|  23/03/2022 02:25:06 | 0 |
|  23/03/2022 02:55:06 | 0 |
|  23/03/2022 03:25:06 | 0 |
|  23/03/2022 03:55:06 | 0 |
|  23/03/2022 04:25:06 | 0 |
|  23/03/2022 04:55:06 | 0 |
|  23/03/2022 05:25:06 | 0 |
|  23/03/2022 05:55:06 | 0 |
|  23/03/2022 06:25:06 | 0 |
|  23/03/2022 06:55:06 | 0 |
|  23/03/2022 07:25:06 | 0 |
|  23/03/2022 07:55:06 | 0 |
|  23/03/2022 08:25:06 | 0 |
|  23/03/2022 08:55:06 | 3.4 |
|  23/03/2022 09:25:06 | 18.6 |
|  23/03/2022 09:55:06 | 36.3 |
|  23/03/2022 10:25:06 | 58.5 |
|  23/03/2022 10:55:06 | 88.4 |
|  23/03/2022 11:25:06 | 125.3 |
|  23/03/2022 11:55:06 | 170 |
|  23/03/2022 12:25:06 | 198.7 |
|  23/03/2022 12:55:06 | 338.7 |
|  23/03/2022 13:25:06 | 399.9 |
|  23/03/2022 13:55:06 | 439.8 |
|  23/03/2022 14:25:06 | 459.4 |
|  23/03/2022 14:55:06 | 448.1 |
|  23/03/2022 15:25:06 | 479.3 |
|  23/03/2022 15:55:06 | 452.4 |
|  23/03/2022 16:25:06 | 446.3 |
|  23/03/2022 16:55:06 | 387.3 |
|  23/03/2022 17:25:06 | 334 |
|  23/03/2022 17:55:06 | 248.5 |
|  23/03/2022 18:25:06 | 195.1 |
|  23/03/2022 18:55:06 | 141.4 |
|  23/03/2022 19:25:06 | 87.6 |
|  23/03/2022 19:55:06 | 58.1 |
|  23/03/2022 20:25:06 | 28.1 |
|  23/03/2022 20:55:06 | 4.3 |
|  23/03/2022 21:25:06 | 0 |
|  23/03/2022 21:55:06 | 0 |
|  23/03/2022 22:25:06 | 0 |
|  23/03/2022 22:55:06 | 0 |
|  23/03/2022 23:25:06 | 0 |
|  23/03/2022 23:55:06 | 0 |
|  24/03/2022 00:25:06 | 0 |
|  24/03/2022 00:55:06 | 0 |
|  24/03/2022 01:25:06 | 0 |
|  24/03/2022 01:55:06 | 0 |
|  24/03/2022 02:25:06 | 0 |
|  24/03/2022 02:55:06 | 0 |
|  24/03/2022 03:25:06 | 0 |
|  24/03/2022 03:55:06 | 0 |
|  24/03/2022 04:25:06 | 0 |
|  24/03/2022 04:55:06 | 0 |
|  24/03/2022 05:25:06 | 0 |
|  24/03/2022 05:55:06 | 0 |
|  24/03/2022 06:25:06 | 0 |
|  24/03/2022 06:55:06 | 0 |
|  24/03/2022 07:25:06 | 0 |
|  24/03/2022 07:55:06 | 0 |
|  24/03/2022 08:25:06 | 0 |
|  24/03/2022 08:55:06 | 0.9 |
|  24/03/2022 09:25:06 | 9.1 |
|  24/03/2022 09:55:06 | 40.7 |
|  24/03/2022 10:25:06 | 66.8 |
|  24/03/2022 10:55:06 | 122.7 |
|  24/03/2022 11:25:06 | 173.5 |
|  24/03/2022 11:55:06 | 149.6 |
|  24/03/2022 12:25:06 | 92.4 |
|  24/03/2022 12:55:06 | 149.6 |
|  24/03/2022 13:25:06 | 142.6 |
|  24/03/2022 13:55:06 | 128.3 |
|  24/03/2022 14:25:06 | 507.5 |
|  24/03/2022 14:55:06 | 443.7 |
|  24/03/2022 15:25:06 | 363.5 |
|  24/03/2022 15:55:06 | 347.4 |
|  24/03/2022 16:25:06 | 522.2 |
|  24/03/2022 16:55:06 | 508.4 |
|  24/03/2022 17:25:06 | 210.3 |
|  24/03/2022 17:55:06 | 301.9 |
|  24/03/2022 18:25:06 | 204.3 |
|  24/03/2022 18:55:06 | 129.7 |
|  24/03/2022 19:25:06 | 99.7 |
|  24/03/2022 19:55:06 | 43.8 |
|  24/03/2022 20:25:06 | 26.8 |
|  24/03/2022 20:55:06 | 6.9 |
|  24/03/2022 21:25:06 | 0 |
|  24/03/2022 21:55:06 | 0 |
|  24/03/2022 22:25:06 | 0 |
|  24/03/2022 22:55:06 | 0 |
|  24/03/2022 23:25:06 | 0 |
|  24/03/2022 23:55:06 | 0 |
|  25/03/2022 00:25:06 | 0 |
|  25/03/2022 00:55:06 | 0 |
|  25/03/2022 01:25:06 | 0 |
|  25/03/2022 01:55:06 | 0 |
|  25/03/2022 02:25:06 | 0 |
|  25/03/2022 02:55:06 | 0 |
|  25/03/2022 03:25:06 | 0 |
|  25/03/2022 03:55:06 | 0 |
|  25/03/2022 04:25:06 | 0 |
|  25/03/2022 04:55:06 | 0 |
|  25/03/2022 05:25:06 | 0 |
|  25/03/2022 05:55:06 | 0 |
|  25/03/2022 06:25:06 | 0 |
|  25/03/2022 06:55:06 | 0 |
|  25/03/2022 07:25:06 | 0 |
|  25/03/2022 07:55:06 | 0 |
|  25/03/2022 08:25:06 | 0 |
|  25/03/2022 08:55:06 | 7.3 |
|  25/03/2022 09:25:06 | 24.2 |
|  25/03/2022 09:55:06 | 36.8 |
|  25/03/2022 10:25:06 | 69.7 |
|  25/03/2022 10:55:06 | 75.8 |
|  25/03/2022 11:25:06 | 137.9 |
|  25/03/2022 11:55:06 | 348.3 |
|  25/03/2022 12:25:06 | 397.7 |
|  25/03/2022 12:55:06 | 448.1 |
|  25/03/2022 13:25:06 | 498.4 |
|  25/03/2022 13:55:06 | 454.1 |
|  25/03/2022 14:25:06 | 537.1 |
|  25/03/2022 14:55:06 | 448.5 |
|  25/03/2022 15:25:06 | 591.2 |
|  25/03/2022 15:55:06 | 581.2 |
|  25/03/2022 16:25:06 | 673.7 |
|  25/03/2022 16:55:06 | 504 |
|  25/03/2022 17:25:06 | 427.2 |
|  25/03/2022 17:55:06 | 294.5 |
|  25/03/2022 18:25:06 | 236.8 |
|  25/03/2022 18:55:06 | 190 |
|  25/03/2022 19:25:06 | 69.4 |
|  25/03/2022 19:55:06 | 50.3 |
|  25/03/2022 20:25:06 | 29.9 |
|  25/03/2022 20:55:06 | 10.8 |
|  25/03/2022 21:25:06 | 0 |
|  25/03/2022 21:55:06 | 0 |
|  25/03/2022 22:25:06 | 0 |
|  25/03/2022 22:55:06 | 0 |
|  25/03/2022 23:25:06 | 0 |
|  25/03/2022 23:55:06 | 0 |
|  26/03/2022 00:25:06 | 0 |
|  26/03/2022 00:55:06 | 0 |
|  26/03/2022 01:25:06 | 0 |
|  26/03/2022 01:55:06 | 0 |
|  26/03/2022 02:25:06 | 0 |
|  26/03/2022 02:55:06 | 0 |
|  26/03/2022 03:25:06 | 0 |
|  26/03/2022 03:55:06 | 0 |
|  26/03/2022 04:25:06 | 0 |
|  26/03/2022 04:55:06 | 0 |
|  26/03/2022 05:25:06 | 0 |
|  26/03/2022 05:55:06 | 0 |
|  26/03/2022 06:25:06 | 0 |
|  26/03/2022 06:55:06 | 0 |
|  26/03/2022 07:25:06 | 0 |
|  26/03/2022 07:55:06 | 0 |
|  26/03/2022 08:25:06 | 0 |
|  26/03/2022 08:55:06 | 10.8 |
|  26/03/2022 09:25:06 | 36.8 |
|  26/03/2022 09:55:06 | 66.8 |
|  26/03/2022 10:25:06 | 142.6 |
|  26/03/2022 10:55:06 | 210.3 |
|  26/03/2022 11:25:06 | 281 |
|  26/03/2022 11:55:06 | 232.4 |
|  26/03/2022 12:25:06 | 403.3 |
|  26/03/2022 12:55:06 | 457.2 |
|  26/03/2022 13:25:06 | 438.9 |
|  26/03/2022 13:55:06 | 446.8 |
|  26/03/2022 14:25:06 | 511 |
|  26/03/2022 14:55:06 | 429.4 |
|  26/03/2022 15:25:06 | 566.9 |
|  26/03/2022 15:55:06 | 586.5 |
|  26/03/2022 16:25:06 | 589 |
|  26/03/2022 16:55:06 | 546.6 |
|  26/03/2022 17:25:06 | 465 |
|  26/03/2022 17:55:06 | 334 |
|  26/03/2022 18:25:06 | 205.5 |
|  26/03/2022 18:55:06 | 186.9 |
|  26/03/2022 19:25:06 | 85 |
|  26/03/2022 19:55:06 | 58.1 |
|  26/03/2022 20:25:06 | 33.4 |
|  26/03/2022 20:55:06 | 11.3 |
|  26/03/2022 21:25:06 | 0 |
|  26/03/2022 21:55:06 | 0 |
|  26/03/2022 22:25:06 | 0 |
|  26/03/2022 22:55:06 | 0 |
|  26/03/2022 23:25:06 | 0 |
|  26/03/2022 23:55:06 | 0 |
|  27/03/2022 00:25:06 | 0 |
|  27/03/2022 00:55:06 | 0 |
|  27/03/2022 01:25:06 | 0 |
|  27/03/2022 01:55:06 | 0 |
|  27/03/2022 02:25:06 | 0 |
|  27/03/2022 02:55:06 | 0 |
|  27/03/2022 03:25:06 | 0 |
|  27/03/2022 03:55:06 | 0 |
|  27/03/2022 04:25:06 | 0 |
|  27/03/2022 04:55:06 | 0 |
|  27/03/2022 05:25:06 | 0 |
|  27/03/2022 05:55:06 | 0 |
|  27/03/2022 06:25:06 | 0 |
|  27/03/2022 06:55:06 | 0 |
|  27/03/2022 07:25:06 | 0 |
|  27/03/2022 07:55:06 | 0 |
|  27/03/2022 08:25:06 | 0 |
|  27/03/2022 08:55:06 | 7.3 |
|  27/03/2022 09:25:06 | 25.9 |
|  27/03/2022 09:55:06 | 42.4 |
|  27/03/2022 10:25:06 | 68.5 |
|  27/03/2022 10:55:06 | 105 |
|  27/03/2022 11:25:06 | 147.4 |
|  27/03/2022 11:55:06 | 500.1 |
|  27/03/2022 12:25:06 | 462.8 |
|  27/03/2022 12:55:06 | 511 |
|  27/03/2022 13:25:06 | 481.9 |
|  27/03/2022 13:55:06 | 567.4 |
|  27/03/2022 14:25:06 | 576.1 |
|  27/03/2022 14:55:06 | 538.8 |
|  27/03/2022 15:25:06 | 484.5 |
|  27/03/2022 15:55:06 | 429 |
|  27/03/2022 16:25:06 | 276.7 |
|  27/03/2022 16:55:06 | 258.5 |
|  27/03/2022 17:25:06 | 190.4 |
|  27/03/2022 17:55:06 | 75.8 |
|  27/03/2022 18:25:06 | 53.7 |
|  27/03/2022 18:55:06 | 32.4 |
|  27/03/2022 19:25:06 | 13 |
|  27/03/2022 19:55:06 | 0 |
|  27/03/2022 20:25:06 | 0 |
|  27/03/2022 20:55:06 | 0 |
|  27/03/2022 21:25:06 | 0 |
|  27/03/2022 21:55:06 | 0 |
|  27/03/2022 22:25:06 | 0 |
|  27/03/2022 22:55:06 | 0 |
|  27/03/2022 23:25:06 | 0 |
|  27/03/2022 23:55:06 | 0 |
|  28/03/2022 00:25:06 | 0 |
|  28/03/2022 00:55:06 | 0 |
|  28/03/2022 01:25:06 | 0 |
|  28/03/2022 01:55:06 | 0 |
|  28/03/2022 02:25:06 | 0 |
|  28/03/2022 02:55:06 | 0 |
|  28/03/2022 03:25:06 | 0 |
|  28/03/2022 03:55:06 | 0 |
|  28/03/2022 04:25:06 | 0 |
|  28/03/2022 04:55:06 | 0 |
|  28/03/2022 05:25:06 | 0 |
|  28/03/2022 05:55:06 | 0 |
|  28/03/2022 06:25:06 | 0 |
|  28/03/2022 06:55:06 | 0.4 |
|  28/03/2022 07:25:06 | 12.1 |
|  28/03/2022 07:55:06 | 38.5 |
|  28/03/2022 08:25:06 | 65.4 |
|  28/03/2022 08:55:06 | 88 |
|  28/03/2022 09:25:06 | 109.7 |
|  28/03/2022 09:55:06 | 174.3 |
|  28/03/2022 10:25:06 | 348.3 |
|  28/03/2022 10:55:06 | 381.7 |
|  28/03/2022 11:25:06 | 451 |
|  28/03/2022 11:55:06 | 491.1 |
|  28/03/2022 12:25:06 | 441.5 |
|  28/03/2022 12:55:06 | 518 |
|  28/03/2022 13:25:06 | 518 |
|  28/03/2022 13:55:06 | 620.2 |
|  28/03/2022 14:25:06 | 284.1 |
|  28/03/2022 14:55:06 | 631.1 |
|  28/03/2022 15:25:06 | 480.2 |
|  28/03/2022 15:55:06 | 414.2 |
|  28/03/2022 16:25:06 | 255.1 |
|  28/03/2022 16:55:06 | 267.5 |
|  28/03/2022 17:25:06 | 185.2 |
|  28/03/2022 17:55:06 | 83.7 |
|  28/03/2022 18:25:06 | 67.2 |
|  28/03/2022 18:55:06 | 36.8 |
|  28/03/2022 19:25:06 | 10.8 |
|  28/03/2022 19:55:06 | 0 |
|  28/03/2022 20:25:06 | 0 |
|  28/03/2022 20:55:06 | 0 |
|  28/03/2022 21:25:06 | 0 |
|  28/03/2022 21:55:06 | 0 |
|  28/03/2022 22:25:06 | 0 |
|  28/03/2022 22:55:06 | 0 |
|  28/03/2022 23:25:06 | 0 |
|  28/03/2022 23:55:06 | 0 |
|  29/03/2022 00:25:06 | 0 |
|  29/03/2022 00:55:06 | 0 |
|  29/03/2022 01:25:06 | 0 |
|  29/03/2022 01:55:06 | 0 |
|  29/03/2022 02:25:06 | 0 |
|  29/03/2022 02:55:06 | 0 |
|  29/03/2022 03:25:06 | 0 |
|  29/03/2022 03:55:06 | 0 |
|  29/03/2022 04:25:06 | 0 |
|  29/03/2022 04:55:06 | 0 |
|  29/03/2022 05:25:06 | 0 |
|  29/03/2022 05:55:06 | 0 |
|  29/03/2022 06:25:06 | 0 |
|  29/03/2022 06:55:06 | 0 |
|  29/03/2022 07:25:06 | 10.4 |
|  29/03/2022 07:55:06 | 29 |
|  29/03/2022 08:25:06 | 53.3 |
|  29/03/2022 08:55:06 | 99.7 |
|  29/03/2022 09:25:06 | 56.3 |
|  29/03/2022 09:55:06 | 36.8 |
|  29/03/2022 10:25:06 | 49.4 |
|  29/03/2022 10:55:06 | 128.8 |
|  29/03/2022 11:25:06 | 105.3 |
|  29/03/2022 11:55:06 | 181.3 |
|  29/03/2022 12:25:06 | 235.5 |
|  29/03/2022 12:55:06 | 246.7 |
|  29/03/2022 13:25:06 | 147.4 |
|  29/03/2022 13:55:06 | 219 |
|  29/03/2022 14:25:06 | 222.9 |
|  29/03/2022 14:55:06 | 140.1 |
|  29/03/2022 15:25:06 | 225.1 |
|  29/03/2022 15:55:06 | 140.1 |
|  29/03/2022 16:25:06 | 87.6 |
|  29/03/2022 16:55:06 | 8.6 |
|  29/03/2022 17:25:06 | 12.5 |
|  29/03/2022 17:55:06 | 11.3 |
|  29/03/2022 18:25:06 | 5.1 |
|  29/03/2022 18:55:06 | 3.8 |
|  29/03/2022 19:25:06 | 2.1 |
|  29/03/2022 19:55:06 | 0 |
|  29/03/2022 20:25:06 | 0 |
|  29/03/2022 20:55:06 | 0 |
|  29/03/2022 21:25:06 | 0 |
|  29/03/2022 21:55:06 | 0 |
|  29/03/2022 22:25:06 | 0 |
|  29/03/2022 22:55:06 | 0 |
|  29/03/2022 23:25:06 | 0 |
|  29/03/2022 23:55:06 | 0 |
|  30/03/2022 00:25:06 | 0 |
|  30/03/2022 00:55:06 | 0 |
|  30/03/2022 01:25:06 | 0 |
|  30/03/2022 01:55:06 | 0 |
|  30/03/2022 02:25:06 | 0 |
|  30/03/2022 02:55:06 | 0 |
|  30/03/2022 03:25:06 | 0 |
|  30/03/2022 03:55:06 | 0 |
|  30/03/2022 04:25:06 | 0 |
|  30/03/2022 04:55:06 | 0 |
|  30/03/2022 05:25:06 | 0 |
|  30/03/2022 05:55:06 | 0 |
|  30/03/2022 06:25:06 | 0 |
|  30/03/2022 06:55:06 | 2.1 |
|  30/03/2022 07:25:06 | 14.3 |
|  30/03/2022 07:55:06 | 35.5 |
|  30/03/2022 08:25:06 | 49.8 |
|  30/03/2022 08:55:06 | 129.7 |
|  30/03/2022 09:25:06 | 254.2 |
|  30/03/2022 09:55:06 | 111.4 |
|  30/03/2022 10:25:06 | 426.3 |
|  30/03/2022 10:55:06 | 378.6 |
|  30/03/2022 11:25:06 | 490.2 |
|  30/03/2022 11:55:06 | 554.8 |
|  30/03/2022 12:25:06 | 94.1 |
|  30/03/2022 12:55:06 | 137 |
|  30/03/2022 13:25:06 | 678.8 |
|  30/03/2022 13:55:06 | 90.6 |
|  30/03/2022 14:25:06 | 756.5 |
|  30/03/2022 14:55:06 | 173.5 |
|  30/03/2022 15:25:06 | 576.4 |
|  30/03/2022 15:55:06 | 457.7 |
|  30/03/2022 16:25:06 | 167.4 |
|  30/03/2022 16:55:06 | 381.7 |
|  30/03/2022 17:25:06 | 197.3 |
|  30/03/2022 17:55:06 | 48.6 |
|  30/03/2022 18:25:06 | 102.3 |
|  30/03/2022 18:55:06 | 25.1 |
|  30/03/2022 19:25:06 | 12.5 |
|  30/03/2022 19:55:06 | 1.2 |
|  30/03/2022 20:25:06 | 0 |
|  30/03/2022 20:55:06 | 0 |
|  30/03/2022 21:25:06 | 0 |
|  30/03/2022 21:55:06 | 0 |
|  30/03/2022 22:25:06 | 0 |
|  30/03/2022 22:55:06 | 0 |
|  30/03/2022 23:25:06 | 0 |
|  30/03/2022 23:55:06 | 0 |
|  31/03/2022 00:25:06 | 0 |
|  31/03/2022 00:55:06 | 0 |
|  31/03/2022 01:25:06 | 0 |
|  31/03/2022 01:55:06 | 0 |
|  31/03/2022 02:25:06 | 0 |
|  31/03/2022 02:55:06 | 0 |
|  31/03/2022 03:25:06 | 0 |
|  31/03/2022 03:55:06 | 0 |
|  31/03/2022 04:25:06 | 0 |
|  31/03/2022 04:55:06 | 0 |
|  31/03/2022 05:25:06 | 0 |
|  31/03/2022 05:55:06 | 0 |
|  31/03/2022 06:25:06 | 0 |
|  31/03/2022 06:55:06 | 3.4 |
|  31/03/2022 07:25:06 | 19.1 |
|  31/03/2022 07:55:06 | 41.6 |
|  31/03/2022 08:25:06 | 95.4 |
|  31/03/2022 08:55:06 | 172.6 |
|  31/03/2022 09:25:06 | 254.6 |
|  31/03/2022 09:55:06 | 321.9 |
|  31/03/2022 10:25:06 | 271.9 |
|  31/03/2022 10:55:06 | 115.7 |
|  31/03/2022 11:25:06 | 498.9 |
|  31/03/2022 11:55:06 | 126.6 |
|  31/03/2022 12:25:06 | 553.4 |
|  31/03/2022 12:55:06 | 589 |
|  31/03/2022 13:25:06 | 593.4 |
|  31/03/2022 13:55:06 | 587.3 |
|  31/03/2022 14:25:06 | 445.4 |
|  31/03/2022 14:55:06 | 669.3 |
|  31/03/2022 15:25:06 | 232.1 |
|  31/03/2022 15:55:06 | 325.3 |
|  31/03/2022 16:25:06 | 120.1 |
|  31/03/2022 16:55:06 | 402.5 |
|  31/03/2022 17:25:06 | 113.2 |
|  31/03/2022 17:55:06 | 59.3 |
|  31/03/2022 18:25:06 | 78.1 |
|  31/03/2022 18:55:06 | 40.2 |
|  31/03/2022 19:25:06 | 16.9 |
|  31/03/2022 19:55:06 | 0 |
|  31/03/2022 20:25:06 | 0 |
|  31/03/2022 20:55:06 | 0 |
|  31/03/2022 21:25:06 | 0 |
|  31/03/2022 21:55:06 | 0 |
|  31/03/2022 22:25:06 | 0 |
|  31/03/2022 22:55:06 | 0 |
|  31/03/2022 23:25:06 | 0 |
|  31/03/2022 23:55:06 | 0 |